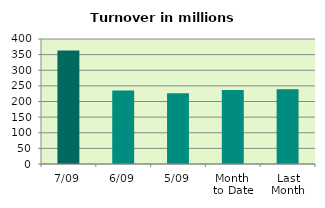
| Category | Series 0 |
|---|---|
| 7/09 | 362.97 |
| 6/09 | 235.204 |
| 5/09 | 226.164 |
| Month 
to Date | 236.768 |
| Last
Month | 239.159 |